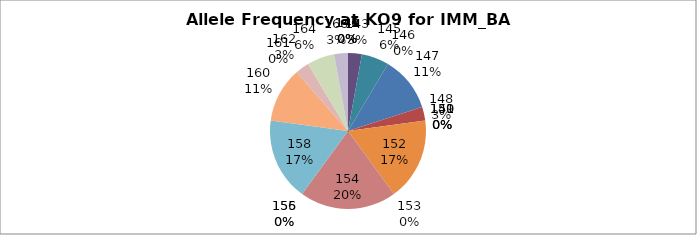
| Category | Series 0 |
|---|---|
| 140.0 | 0 |
| 141.0 | 0 |
| 142.0 | 0 |
| 143.0 | 0.029 |
| 145.0 | 0.057 |
| 146.0 | 0 |
| 147.0 | 0.114 |
| 148.0 | 0.029 |
| 149.0 | 0 |
| 150.0 | 0 |
| 151.0 | 0 |
| 152.0 | 0.171 |
| 153.0 | 0 |
| 154.0 | 0.2 |
| 155.0 | 0 |
| 156.0 | 0 |
| 158.0 | 0.171 |
| 160.0 | 0.114 |
| 161.0 | 0 |
| 162.0 | 0.029 |
| 164.0 | 0.057 |
| 166.0 | 0.029 |